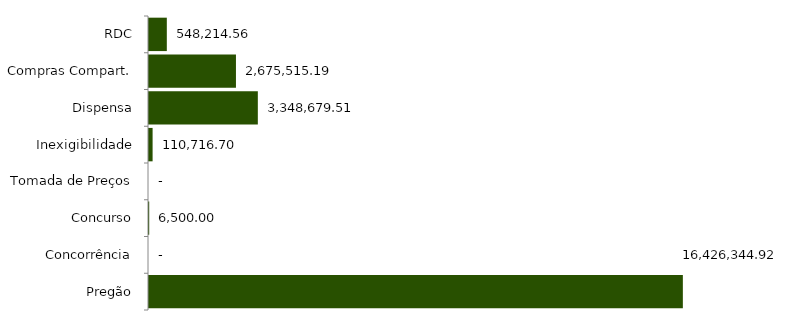
| Category | Series 0 |
|---|---|
| Pregão | 16426344.92 |
| Concorrência | 0 |
| Concurso | 6500 |
| Tomada de Preços | 0 |
| Inexigibilidade | 110716.7 |
| Dispensa | 3348679.51 |
| Compras Compart. | 2675515.19 |
| RDC | 548214.56 |